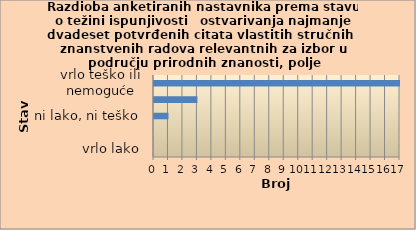
| Category | Series 0 |
|---|---|
| vrlo lako | 0 |
| lako | 0 |
| ni lako, ni teško | 1 |
| teško | 3 |
| vrlo teško ili nemoguće | 17 |